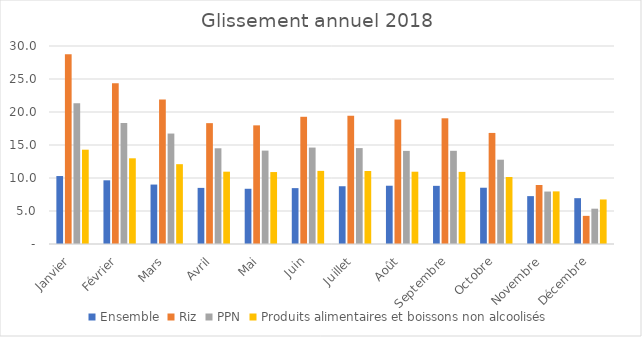
| Category | Ensemble | Riz | PPN | Produits alimentaires et boissons non alcoolisés |
|---|---|---|---|---|
| Janvier | 10.297 | 28.74 | 21.321 | 14.29 |
| Février | 9.651 | 24.34 | 18.331 | 12.985 |
| Mars | 9.006 | 21.876 | 16.736 | 12.094 |
| Avril | 8.502 | 18.311 | 14.502 | 10.958 |
| Mai | 8.368 | 17.977 | 14.15 | 10.901 |
| Juin | 8.467 | 19.275 | 14.611 | 11.08 |
| Juillet | 8.752 | 19.445 | 14.532 | 11.057 |
| Août | 8.829 | 18.861 | 14.109 | 10.953 |
| Septembre | 8.812 | 19.046 | 14.122 | 10.928 |
| Octobre | 8.526 | 16.829 | 12.772 | 10.152 |
| Novembre | 7.254 | 8.943 | 7.947 | 7.972 |
| Décembre | 6.943 | 4.263 | 5.35 | 6.747 |